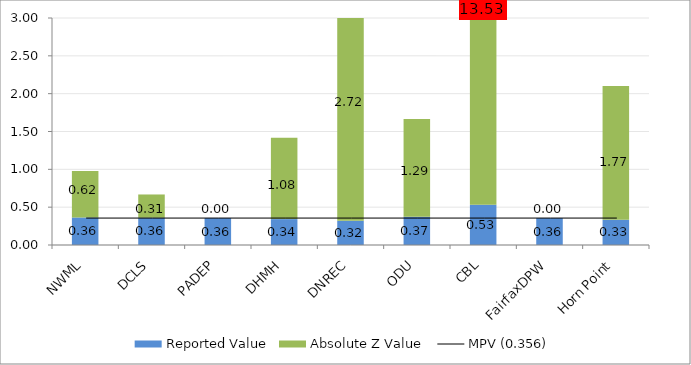
| Category | Reported Value | Absolute Z Value  |
|---|---|---|
| NWML | 0.364 | 0.615 |
| DCLS | 0.36 | 0.308 |
| PADEP | 0.356 | 0 |
| DHMH | 0.342 | 1.077 |
| DNREC | 0.321 | 2.715 |
| ODU | 0.373 | 1.292 |
| CBL | 0.532 | 13.531 |
| FairfaxDPW | 0.356 | 0 |
| Horn Point | 0.333 | 1.769 |